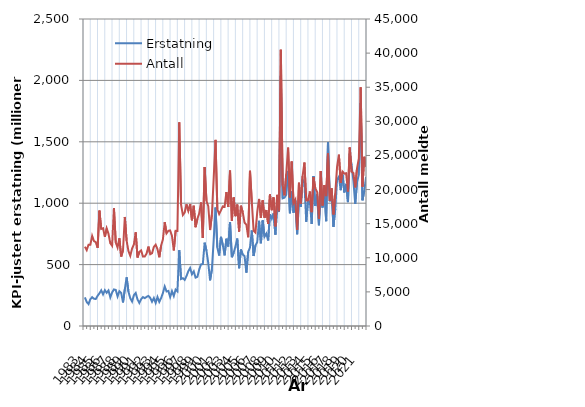
| Category | Erstatning |
|---|---|
| 1983.0 | 232.937 |
| nan | 195.121 |
| nan | 178.438 |
| nan | 218.579 |
| 1984.0 | 234.389 |
| nan | 221.715 |
| nan | 219.826 |
| nan | 245.877 |
| 1985.0 | 265.702 |
| nan | 290.42 |
| nan | 257.346 |
| nan | 291.865 |
| 1986.0 | 270.604 |
| nan | 289.558 |
| nan | 233.055 |
| nan | 272.728 |
| 1987.0 | 297.95 |
| nan | 294.021 |
| nan | 240.61 |
| nan | 283.085 |
| 1988.0 | 269.44 |
| nan | 192.069 |
| nan | 299.153 |
| nan | 396.293 |
| 1989.0 | 279.972 |
| nan | 226.285 |
| nan | 199.112 |
| nan | 251.201 |
| 1990.0 | 268.971 |
| nan | 216.388 |
| nan | 187.666 |
| nan | 218.436 |
| 1991.0 | 235.713 |
| nan | 226.637 |
| nan | 237.191 |
| nan | 245.226 |
| 1992.0 | 229.086 |
| nan | 197.393 |
| nan | 228.083 |
| nan | 188.213 |
| 1993.0 | 236.156 |
| nan | 196.535 |
| nan | 227.061 |
| nan | 268.62 |
| 1994.0 | 321.731 |
| nan | 281.266 |
| nan | 285.763 |
| nan | 235.54 |
| 1995.0 | 283.776 |
| nan | 244.132 |
| nan | 296.645 |
| nan | 281.65 |
| 1996.0 | 617.657 |
| nan | 382.464 |
| nan | 389.296 |
| nan | 375.446 |
| 1997.0 | 406.453 |
| nan | 446.013 |
| nan | 472.333 |
| nan | 421.43 |
| 1998.0 | 444.599 |
| nan | 393.872 |
| nan | 400.307 |
| nan | 460.108 |
| 1999.0 | 501.845 |
| nan | 504.283 |
| nan | 678.577 |
| nan | 614.541 |
| 2000.0 | 512.261 |
| nan | 372.014 |
| nan | 461.192 |
| nan | 703.176 |
| 2001.0 | 965.028 |
| nan | 638.852 |
| nan | 573.774 |
| nan | 725.942 |
| 2002.0 | 661.156 |
| nan | 575.27 |
| nan | 710.935 |
| nan | 647.82 |
| 2003.0 | 847.26 |
| nan | 560.178 |
| nan | 595.958 |
| nan | 649.208 |
| 2004.0 | 712.217 |
| nan | 470.87 |
| nan | 622.509 |
| nan | 581.854 |
| 2005.0 | 569.493 |
| nan | 434.602 |
| nan | 603.345 |
| nan | 639.394 |
| 2006.0 | 777.195 |
| nan | 569.965 |
| nan | 655.815 |
| nan | 684.196 |
| 2007.0 | 856.408 |
| nan | 673.317 |
| nan | 860.276 |
| nan | 727.347 |
| 2008.0 | 752.172 |
| nan | 696.322 |
| nan | 909.437 |
| nan | 873.42 |
| 2009.0 | 916.557 |
| nan | 744.098 |
| nan | 982.934 |
| nan | 929.078 |
| 2010.0 | 2038.021 |
| nan | 1039.492 |
| nan | 1044.493 |
| nan | 1068.56 |
| 2011.0 | 1262.842 |
| nan | 918.31 |
| nan | 1094.943 |
| nan | 922.779 |
| 2012.0 | 1022.313 |
| nan | 747.404 |
| nan | 1030.461 |
| nan | 970.277 |
| 2013.0 | 1191.601 |
| nan | 1166.802 |
| nan | 849.019 |
| nan | 1025.516 |
| 2014.0 | 1011.435 |
| nan | 830.588 |
| nan | 1221.838 |
| nan | 976.933 |
| 2015.0 | 1071.822 |
| nan | 820.828 |
| nan | 1086.542 |
| nan | 964.725 |
| 2016.0 | 1109.027 |
| nan | 853.659 |
| nan | 1497.167 |
| nan | 1015.828 |
| 2017.0 | 1088.954 |
| nan | 807.65 |
| nan | 953.843 |
| nan | 1191.034 |
| 2018.0 | 1215.874 |
| nan | 1106.121 |
| nan | 1232.942 |
| nan | 1087.816 |
| 2019.0 | 1157.146 |
| nan | 1008.947 |
| nan | 1404.229 |
| nan | 1307.73 |
| 2020.0 | 1182.332 |
| nan | 993.156 |
| nan | 1172.187 |
| nan | 1232.095 |
| 2021.0 | 1816.576 |
| nan | 1023.29 |
| nan | 1100.655 |
| nan | 1213.6 |